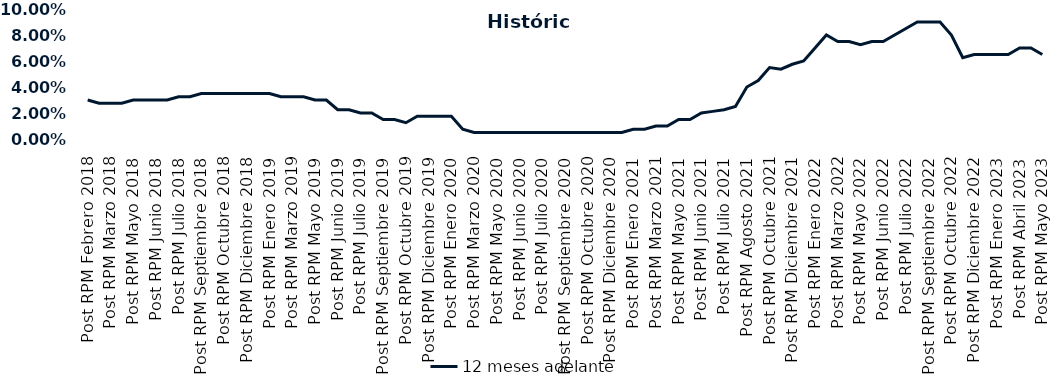
| Category | 12 meses adelante  |
|---|---|
| Post RPM Febrero 2018 | 0.03 |
| Pre RPM Marzo 2018 | 0.028 |
| Post RPM Marzo 2018 | 0.028 |
| Pre RPM Mayo 2018 | 0.028 |
| Post RPM Mayo 2018 | 0.03 |
| Pre RPM Junio 2018 | 0.03 |
| Post RPM Junio 2018 | 0.03 |
| Pre RPM Julio 2018 | 0.03 |
| Post RPM Julio 2018 | 0.032 |
| Pre RPM Septiembre 2018 | 0.032 |
| Post RPM Septiembre 2018 | 0.035 |
| Pre RPM Octubre 2018 | 0.035 |
| Post RPM Octubre 2018 | 0.035 |
| Pre RPM Diciembre 2018 | 0.035 |
| Post RPM Diciembre 2018 | 0.035 |
| Pre RPM Enero 2019 | 0.035 |
| Post RPM Enero 2019 | 0.035 |
| Pre RPM Marzo 2019 | 0.032 |
| Post RPM Marzo 2019 | 0.032 |
| Pre RPM Mayo 2019 | 0.032 |
| Post RPM Mayo 2019 | 0.03 |
| Pre RPM Junio 2019 | 0.03 |
| Post RPM Junio 2019 | 0.022 |
| Pre RPM Julio 2019 | 0.022 |
| Post RPM Julio 2019 | 0.02 |
| Pre RPM Septiembre 2019 | 0.02 |
| Post RPM Septiembre 2019 | 0.015 |
| Pre RPM Octubre 2019 | 0.015 |
| Post RPM Octubre 2019 | 0.012 |
| Pre RPM Diciembre 2019 | 0.018 |
| Post RPM Diciembre 2019 | 0.018 |
| Pre RPM Enero 2020 | 0.018 |
| Post RPM Enero 2020 | 0.018 |
| Pre RPM Marzo 2020 | 0.008 |
| Post RPM Marzo 2020 | 0.005 |
| Pre RPM Mayo 2020 | 0.005 |
| Post RPM Mayo 2020 | 0.005 |
| Pre RPM Junio 2020 | 0.005 |
| Post RPM Junio 2020 | 0.005 |
| Pre RPM Julio 2020 | 0.005 |
| Post RPM Julio 2020 | 0.005 |
| Pre RPM Septiembre 2020 | 0.005 |
| Post RPM Septiembre 2020 | 0.005 |
| Pre RPM Octubre 2020 | 0.005 |
| Post RPM Octubre 2020 | 0.005 |
| Pre RPM Diciembre 2020 | 0.005 |
| Post RPM Diciembre 2020 | 0.005 |
| Pre RPM Enero 2021 | 0.005 |
| Post RPM Enero 2021 | 0.008 |
| Pre RPM Marzo 2021 | 0.008 |
| Post RPM Marzo 2021 | 0.01 |
| Pre RPM Mayo 2021 | 0.01 |
| Post RPM Mayo 2021 | 0.015 |
| Pre RPM Junio 2021 | 0.015 |
| Post RPM Junio 2021 | 0.02 |
| Pre RPM Julio 2021 | 0.021 |
| Post RPM Julio 2021 | 0.022 |
| Pre RPM Agosto 2021 | 0.025 |
| Post RPM Agosto 2021 | 0.04 |
| Pre RPM Octubre 2021 | 0.045 |
| Post RPM Octubre 2021 | 0.055 |
| Pre RPM Diciembre 2021 | 0.054 |
| Post RPM Diciembre 2021 | 0.058 |
| Pre RPM Enero 2022 | 0.06 |
| Post RPM Enero 2022 | 0.07 |
| Pre RPM Marzo 2022 | 0.08 |
| Post RPM Marzo 2022 | 0.075 |
| Pre RPM Mayo 2022 | 0.075 |
| Post RPM Mayo 2022 | 0.072 |
| Pre RPM Junio 2022 | 0.075 |
| Post RPM Junio 2022 | 0.075 |
| Pre RPM Julio 2022 | 0.08 |
| Post RPM Julio 2022 | 0.085 |
| Pre RPM Septiembre 2022 | 0.09 |
| Post RPM Septiembre 2022 | 0.09 |
| Pre RPM Octubre 2022 | 0.09 |
| Post RPM Octubre 2022 | 0.08 |
| Pre RPM Diciembre 2022 | 0.062 |
| Post RPM Diciembre 2022 | 0.065 |
| Pre RPM Enero 2023 | 0.065 |
| Post RPM Enero 2023 | 0.065 |
| Pre RPM Abril 2023 | 0.065 |
| Post RPM Abril 2023 | 0.07 |
| Pre RPM Mayo 2023 | 0.07 |
| Post RPM Mayo 2023 | 0.065 |